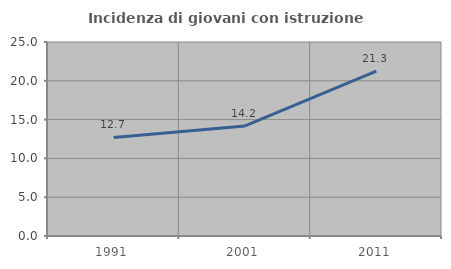
| Category | Incidenza di giovani con istruzione universitaria |
|---|---|
| 1991.0 | 12.698 |
| 2001.0 | 14.179 |
| 2011.0 | 21.26 |